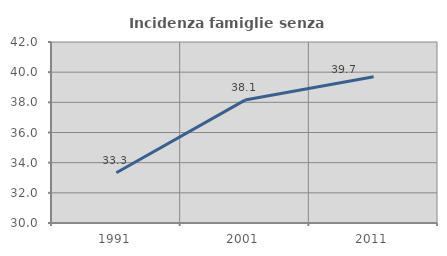
| Category | Incidenza famiglie senza nuclei |
|---|---|
| 1991.0 | 33.333 |
| 2001.0 | 38.149 |
| 2011.0 | 39.698 |